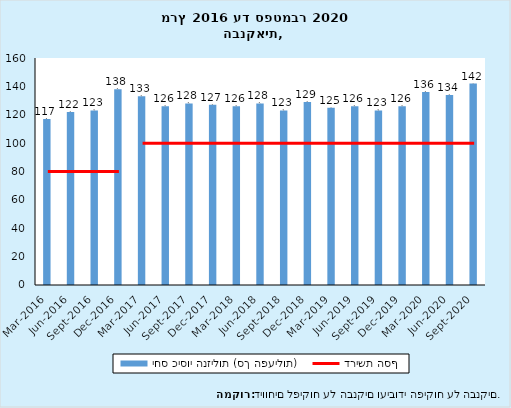
| Category | יחס כיסוי הנזילות (סך הפעילות) |
|---|---|
| 2016-03-31 | 117 |
| 2016-06-30 | 122 |
| 2016-09-30 | 123 |
| 2016-12-31 | 138 |
| 2017-03-31 | 133 |
| 2017-06-30 | 126 |
| 2017-09-30 | 128 |
| 2017-12-31 | 127 |
| 2018-03-31 | 126 |
| 2018-06-30 | 128 |
| 2018-09-30 | 123 |
| 2018-12-31 | 129 |
| 2019-03-31 | 125 |
| 2019-06-30 | 126 |
| 2019-09-30 | 123 |
| 2019-12-31 | 126 |
| 2020-03-31 | 136 |
| 2020-06-30 | 134 |
| 2020-09-30 | 142 |